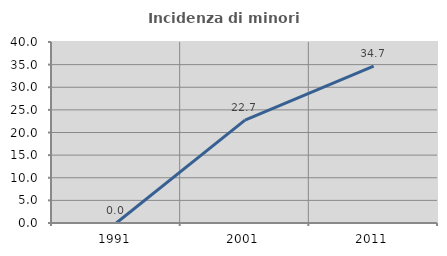
| Category | Incidenza di minori stranieri |
|---|---|
| 1991.0 | 0 |
| 2001.0 | 22.727 |
| 2011.0 | 34.661 |